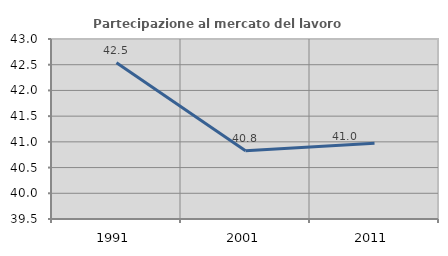
| Category | Partecipazione al mercato del lavoro  femminile |
|---|---|
| 1991.0 | 42.538 |
| 2001.0 | 40.827 |
| 2011.0 | 40.974 |